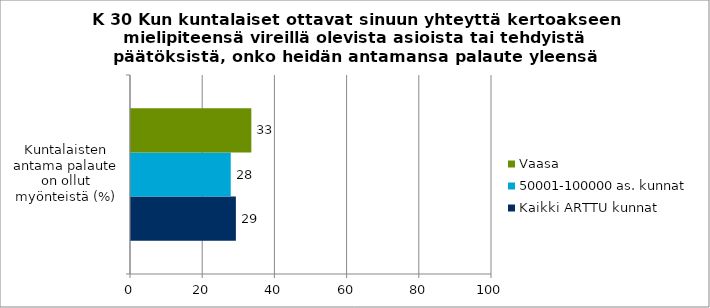
| Category | Kaikki ARTTU kunnat | 50001-100000 as. kunnat | Vaasa |
|---|---|---|---|
| Kuntalaisten antama palaute on ollut myönteistä (%) | 29.053 | 27.628 | 33.333 |